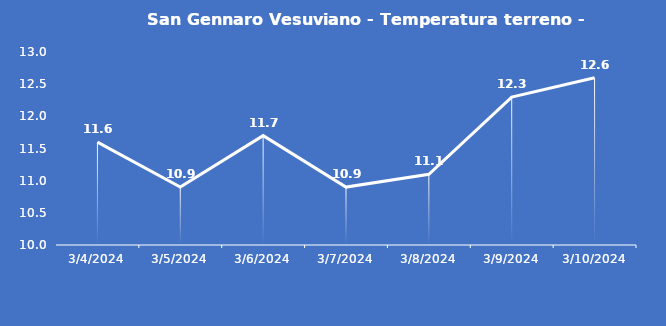
| Category | San Gennaro Vesuviano - Temperatura terreno - Grezzo (°C) |
|---|---|
| 3/4/24 | 11.6 |
| 3/5/24 | 10.9 |
| 3/6/24 | 11.7 |
| 3/7/24 | 10.9 |
| 3/8/24 | 11.1 |
| 3/9/24 | 12.3 |
| 3/10/24 | 12.6 |